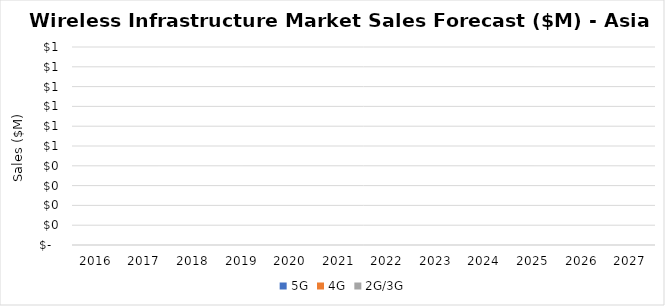
| Category | 5G | 4G | 2G/3G |
|---|---|---|---|
| 2016.0 | 0 | 0 | 0 |
| 2017.0 | 0 | 0 | 0 |
| 2018.0 | 0 | 0 | 0 |
| 2019.0 | 0 | 0 | 0 |
| 2020.0 | 0 | 0 | 0 |
| 2021.0 | 0 | 0 | 0 |
| 2022.0 | 0 | 0 | 0 |
| 2023.0 | 0 | 0 | 0 |
| 2024.0 | 0 | 0 | 0 |
| 2025.0 | 0 | 0 | 0 |
| 2026.0 | 0 | 0 | 0 |
| 2027.0 | 0 | 0 | 0 |